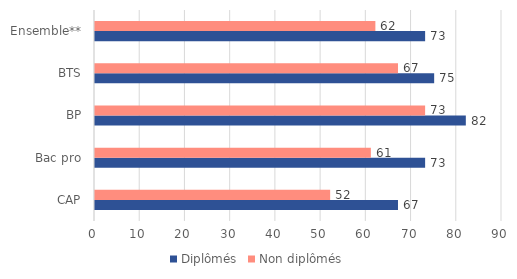
| Category | Diplômés | Non diplômés |
|---|---|---|
| CAP | 67 | 52 |
| Bac pro | 73 | 61 |
| BP | 82 | 73 |
| BTS | 75 | 67 |
| Ensemble** | 73 | 62 |